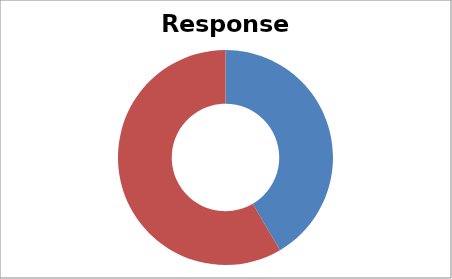
| Category | Total |
|---|---|
| Sum of Overall Response | 41.54 |
| Sum of Non-resp | 58.46 |